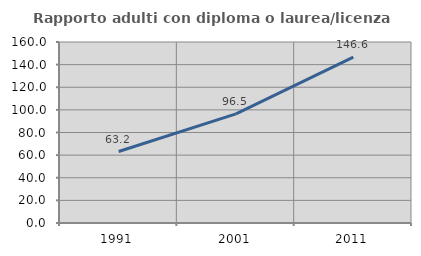
| Category | Rapporto adulti con diploma o laurea/licenza media  |
|---|---|
| 1991.0 | 63.168 |
| 2001.0 | 96.454 |
| 2011.0 | 146.591 |